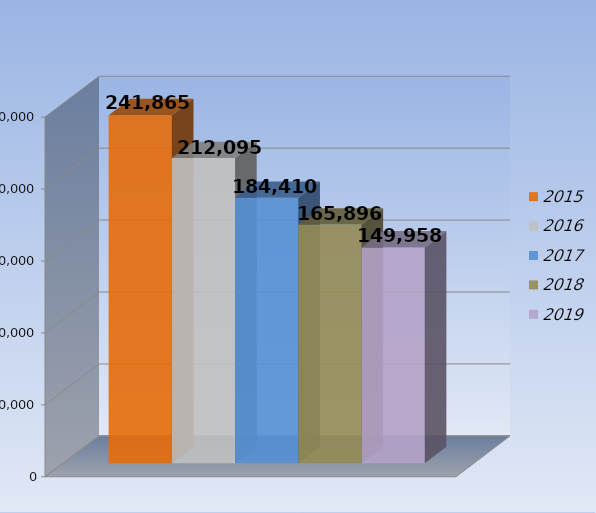
| Category | 2015 | 2016 | 2017 | 2018 | 2019 |
|---|---|---|---|---|---|
| 0 | 241865 | 212095 | 184410 | 165896 | 149958 |